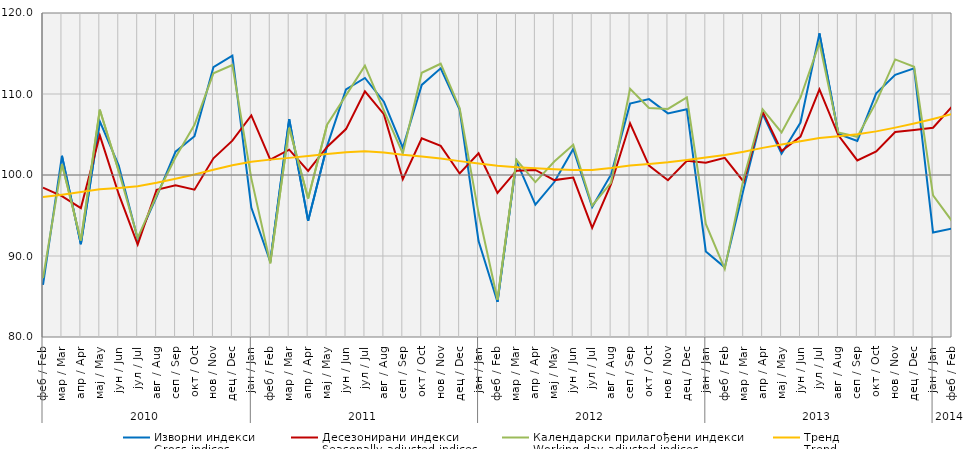
| Category | Изворни индекси
Gross indices | Десезонирани индекси
Seasonally adjusted indices | Календарски прилагођени индекси
Working-day adjusted indices | Тренд
Trend |
|---|---|---|---|---|
| 0 | 86.443 | 98.437 | 87.272 | 97.279 |
| 1 | 102.372 | 97.398 | 101.347 | 97.563 |
| 2 | 91.457 | 95.919 | 91.919 | 97.89 |
| 3 | 106.618 | 104.895 | 108.059 | 98.23 |
| 4 | 101.158 | 97.629 | 100.481 | 98.407 |
| 5 | 92.091 | 91.408 | 92.246 | 98.605 |
| 6 | 97.34 | 98.176 | 97.503 | 99.035 |
| 7 | 102.887 | 98.724 | 102.199 | 99.535 |
| 8 | 104.784 | 98.192 | 106.2 | 100.065 |
| 9 | 113.309 | 102.062 | 112.551 | 100.651 |
| 10 | 114.724 | 104.243 | 113.575 | 101.208 |
| 11 | 95.976 | 107.354 | 99.585 | 101.63 |
| 12 | 89.293 | 101.89 | 89.096 | 101.898 |
| 13 | 106.89 | 103.129 | 105.82 | 102.114 |
| 14 | 94.359 | 100.515 | 97.088 | 102.333 |
| 15 | 103.572 | 103.463 | 106.212 | 102.579 |
| 16 | 110.572 | 105.67 | 109.832 | 102.814 |
| 17 | 111.982 | 110.33 | 113.495 | 102.925 |
| 18 | 109.048 | 107.503 | 107.956 | 102.788 |
| 19 | 103.369 | 99.474 | 102.678 | 102.511 |
| 20 | 111.125 | 104.52 | 112.627 | 102.29 |
| 21 | 113.167 | 103.595 | 113.738 | 102.025 |
| 22 | 108.083 | 100.19 | 108.264 | 101.713 |
| 23 | 91.849 | 102.683 | 95.302 | 101.428 |
| 24 | 84.325 | 97.784 | 84.601 | 101.152 |
| 25 | 101.706 | 100.53 | 101.877 | 100.962 |
| 26 | 96.339 | 100.625 | 99.126 | 100.82 |
| 27 | 99.133 | 99.37 | 101.659 | 100.697 |
| 28 | 103.214 | 99.681 | 103.735 | 100.613 |
| 29 | 96.046 | 93.47 | 96.207 | 100.616 |
| 30 | 100.071 | 98.886 | 99.069 | 100.855 |
| 31 | 108.809 | 106.38 | 110.649 | 101.178 |
| 32 | 109.371 | 101.168 | 108.276 | 101.369 |
| 33 | 107.609 | 99.358 | 108.151 | 101.562 |
| 34 | 108.112 | 101.757 | 109.573 | 101.838 |
| 35 | 90.559 | 101.526 | 93.964 | 102.15 |
| 36 | 88.596 | 102.113 | 88.401 | 102.475 |
| 37 | 98.288 | 99.168 | 99.616 | 102.872 |
| 38 | 107.567 | 107.823 | 108.109 | 103.348 |
| 39 | 102.635 | 102.969 | 105.251 | 103.756 |
| 40 | 106.478 | 104.738 | 109.558 | 104.167 |
| 41 | 117.488 | 110.577 | 116.311 | 104.562 |
| 42 | 105.073 | 104.895 | 105.25 | 104.799 |
| 43 | 104.198 | 101.804 | 104.724 | 105.027 |
| 44 | 110.096 | 102.918 | 108.993 | 105.387 |
| 45 | 112.368 | 105.312 | 114.269 | 105.851 |
| 46 | 113.169 | 105.566 | 113.359 | 106.36 |
| 47 | 92.9 | 105.83 | 97.491 | 106.917 |
| 48 | 93.4 | 108.428 | 94.304 | 107.522 |